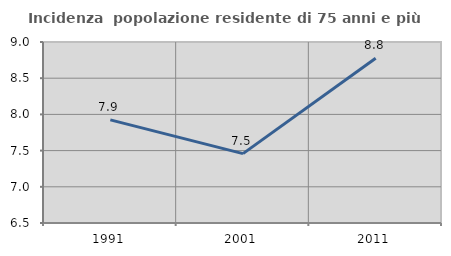
| Category | Incidenza  popolazione residente di 75 anni e più |
|---|---|
| 1991.0 | 7.924 |
| 2001.0 | 7.459 |
| 2011.0 | 8.775 |